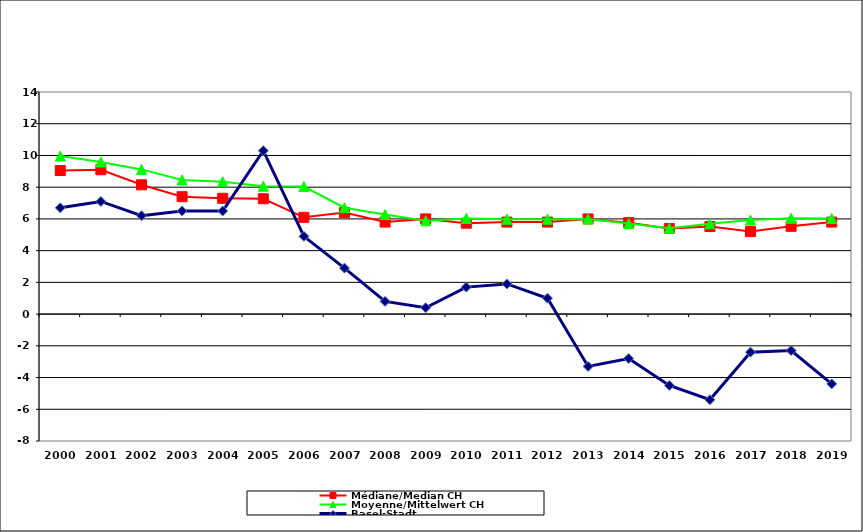
| Category | Médiane/Median CH | Moyenne/Mittelwert CH | Basel-Stadt |
|---|---|---|---|
| 2000.0 | 9.05 | 9.964 | 6.7 |
| 2001.0 | 9.1 | 9.588 | 7.1 |
| 2002.0 | 8.15 | 9.121 | 6.2 |
| 2003.0 | 7.4 | 8.458 | 6.5 |
| 2004.0 | 7.3 | 8.345 | 6.5 |
| 2005.0 | 7.27 | 8.061 | 10.3 |
| 2006.0 | 6.1 | 8.039 | 4.9 |
| 2007.0 | 6.4 | 6.706 | 2.9 |
| 2008.0 | 5.8 | 6.277 | 0.8 |
| 2009.0 | 6 | 5.883 | 0.4 |
| 2010.0 | 5.73 | 6.031 | 1.7 |
| 2011.0 | 5.8 | 5.983 | 1.9 |
| 2012.0 | 5.8 | 5.983 | 1 |
| 2013.0 | 6 | 5.994 | -3.3 |
| 2014.0 | 5.765 | 5.705 | -2.8 |
| 2015.0 | 5.4 | 5.408 | -4.5 |
| 2016.0 | 5.52 | 5.692 | -5.4 |
| 2017.0 | 5.2 | 5.927 | -2.4 |
| 2018.0 | 5.535 | 6.039 | -2.3 |
| 2019.0 | 5.8 | 6.026 | -4.4 |